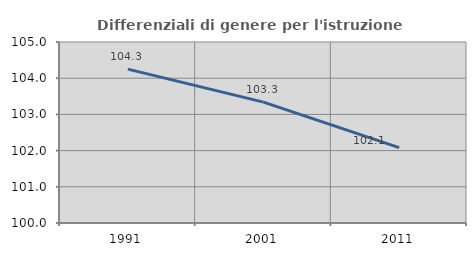
| Category | Differenziali di genere per l'istruzione superiore |
|---|---|
| 1991.0 | 104.251 |
| 2001.0 | 103.338 |
| 2011.0 | 102.083 |